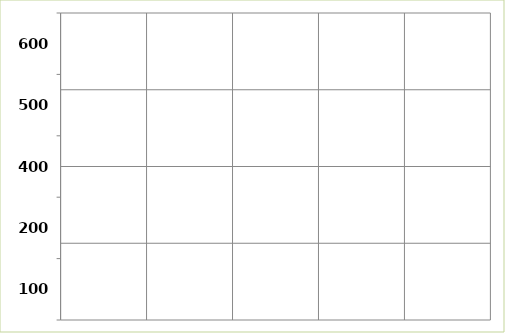
| Category | Series 0 |
|---|---|
| 100.0 | 0 |
| 200.0 | 0 |
| 400.0 | 0 |
| 500.0 | 0 |
| 600.0 | 0 |